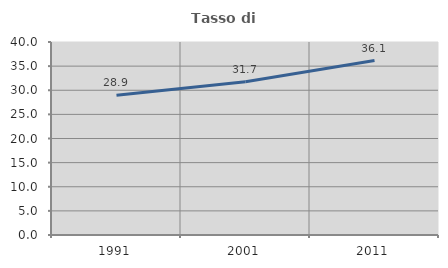
| Category | Tasso di occupazione   |
|---|---|
| 1991.0 | 28.947 |
| 2001.0 | 31.745 |
| 2011.0 | 36.145 |